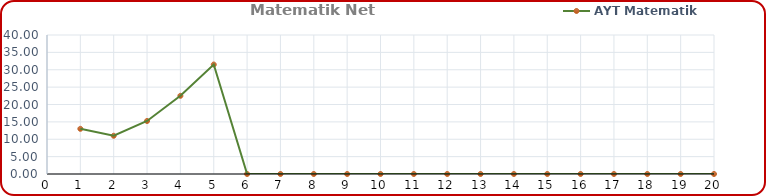
| Category | AYT Matematik |
|---|---|
| 0 | 13 |
| 1 | 11 |
| 2 | 15.25 |
| 3 | 22.5 |
| 4 | 31.5 |
| 5 | 0 |
| 6 | 0 |
| 7 | 0 |
| 8 | 0 |
| 9 | 0 |
| 10 | 0 |
| 11 | 0 |
| 12 | 0 |
| 13 | 0 |
| 14 | 0 |
| 15 | 0 |
| 16 | 0 |
| 17 | 0 |
| 18 | 0 |
| 19 | 0 |